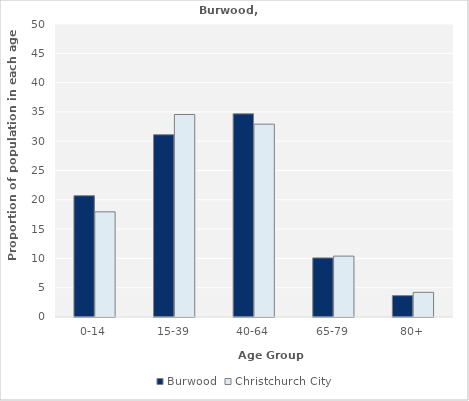
| Category | Burwood | Christchurch City |
|---|---|---|
| 0-14 | 20.697 | 17.945 |
| 15-39 | 31.107 | 34.556 |
| 40-64 | 34.672 | 32.907 |
| 65-79 | 10.082 | 10.392 |
| 80+ | 3.648 | 4.211 |